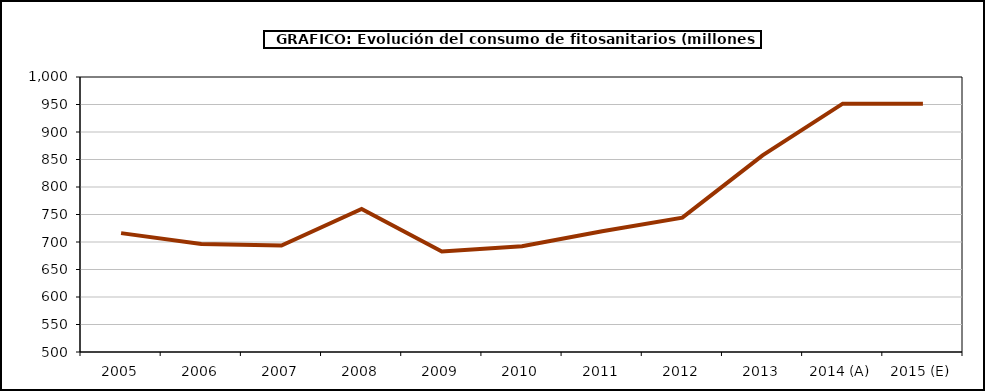
| Category | fitosanitarios |
|---|---|
| 2005 | 716.165 |
| 2006 | 696.177 |
| 2007 | 693.603 |
| 2008 | 760.166 |
| 2009 | 682.842 |
| 2010 | 692.238 |
| 2011 | 719.583 |
| 2012 | 744.231 |
| 2013 | 857.443 |
| 2014 (A) | 951.565 |
| 2015 (E) | 951.569 |